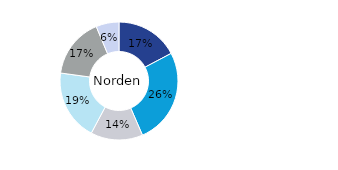
| Category | Norden |
|---|---|
| Kontor | 0.173 |
| Bostäder | 0.262 |
| Handel | 0.143 |
| Logistik* | 0.194 |
| Samhällsfastigheter | 0.165 |
| Övrigt | 0.063 |